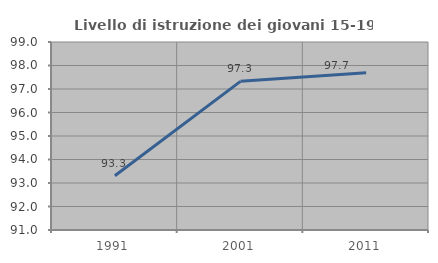
| Category | Livello di istruzione dei giovani 15-19 anni |
|---|---|
| 1991.0 | 93.307 |
| 2001.0 | 97.326 |
| 2011.0 | 97.696 |